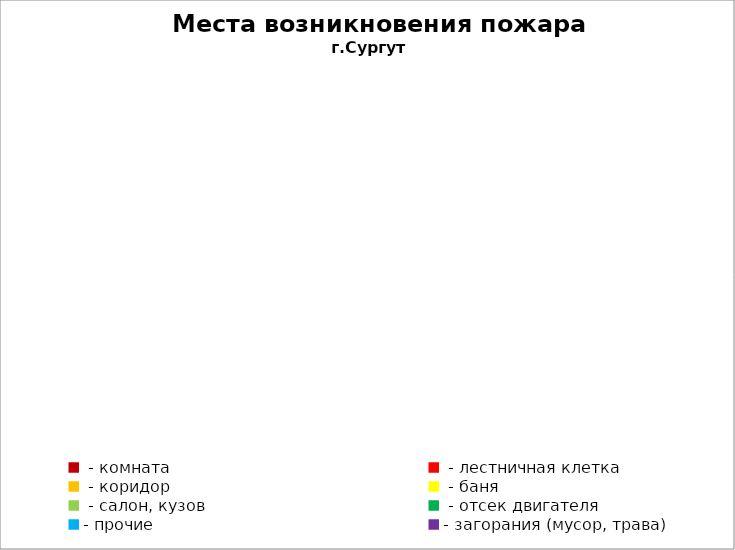
| Category | Места возникновения пожара |
|---|---|
|  - комната | 56 |
|  - лестничная клетка | 7 |
|  - коридор | 4 |
|  - баня | 24 |
|  - салон, кузов | 11 |
|  - отсек двигателя | 32 |
| - прочие | 86 |
| - загорания (мусор, трава)  | 110 |